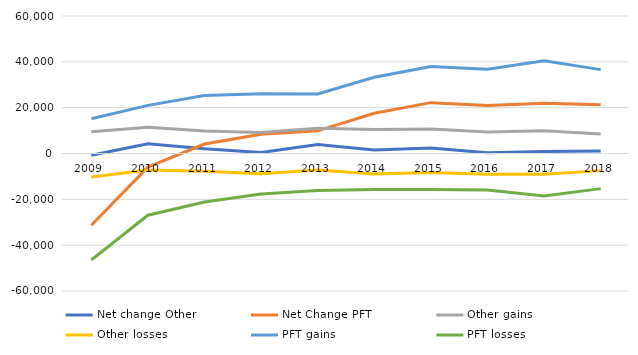
| Category | Net change Other  | Net Change PFT  | Other gains | Other losses | PFT gains | PFT losses |
|---|---|---|---|---|---|---|
| 2009.0 | -736 | -31337 | 9475 | -10211 | 15142 | -46479 |
| 2010.0 | 4275 | -5942 | 11459 | -7184 | 20995 | -26937 |
| 2011.0 | 2079 | 4132 | 9865 | -7786 | 25286 | -21154 |
| 2012.0 | 408 | 8410 | 9194 | -8786 | 26035 | -17625 |
| 2013.0 | 3876 | 9873 | 11070 | -7194 | 26016 | -16143 |
| 2014.0 | 1551 | 17568 | 10497 | -8946 | 33287 | -15719 |
| 2015.0 | 2360 | 22192 | 10702 | -8342 | 37922 | -15730 |
| 2016.0 | 365 | 20918 | 9373 | -9008 | 36818 | -15900 |
| 2017.0 | 913 | 21978 | 9931 | -9018 | 40475 | -18497 |
| 2018.0 | 1049 | 21279 | 8522 | -7473 | 36601 | -15322 |